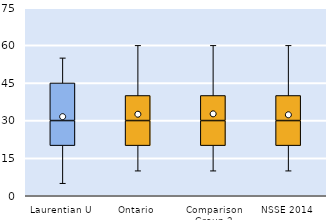
| Category | 25th | 50th | 75th |
|---|---|---|---|
| Laurentian U | 20 | 10 | 15 |
| Ontario | 20 | 10 | 10 |
| Comparison Group 2 | 20 | 10 | 10 |
| NSSE 2014 | 20 | 10 | 10 |